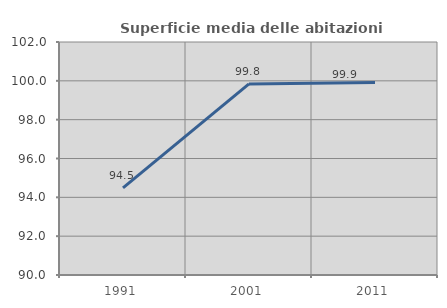
| Category | Superficie media delle abitazioni occupate |
|---|---|
| 1991.0 | 94.486 |
| 2001.0 | 99.841 |
| 2011.0 | 99.916 |